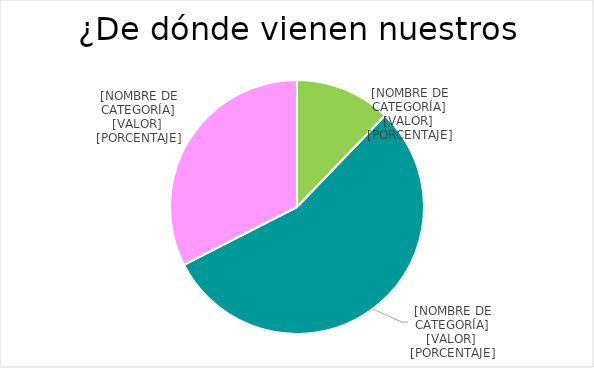
| Category | Series 0 |
|---|---|
| Donaciones/ subvenciones | 760 |
| Personas socias | 3450 |
| Campañas | 2028.74 |